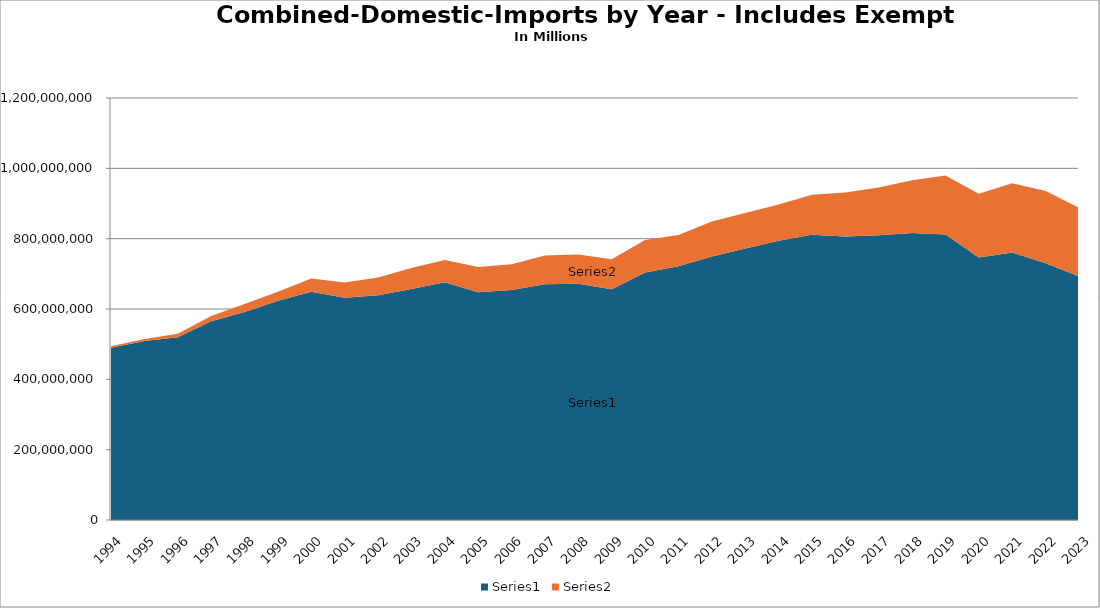
| Category | Series 0 | Series 1 |
|---|---|---|
| 1994 | 489900000 | 4060000 |
| 1995 | 509300000 | 5720000 |
| 1996 | 519730000 | 9940000 |
| 1997 | 564990000 | 15450000 |
| 1998 | 591710000 | 22840000 |
| 1999 | 623312000 | 25960000 |
| 2000 | 648775000 | 37995000 |
| 2001 | 631870000 | 43550000 |
| 2002 | 638880000 | 50899704.762 |
| 2003 | 656953556 | 59697493.887 |
| 2004 | 675963429 | 63676294.421 |
| 2005 | 647653438 | 71693357.114 |
| 2006 | 654295090.279 | 73029558.509 |
| 2007 | 670320908.747 | 81603702.512 |
| 2008 | 671760569.61 | 83183162 |
| 2009 | 656296449.81 | 85084570 |
| 2010 | 703716570.51 | 92390238 |
| 2011 | 721594535.57 | 88537774 |
| 2012 | 749479653 | 99126506 |
| 2013 | 771993455.99 | 100869339 |
| 2014 | 794087706.91 | 103307752 |
| 2015 | 810973172 | 114162606 |
| 2016 | 805942429.818 | 125562383 |
| 2017 | 809865466.727 | 135506544 |
| 2018 | 816374282.45 | 149687000 |
| 2019 | 811494774 | 167785373 |
| 2020 | 746300000 | 181160000 |
| 2021 | 760986000 | 196783000 |
| 2022 | 730056000 | 205809000 |
| 2023 | 692901000 | 194971000 |